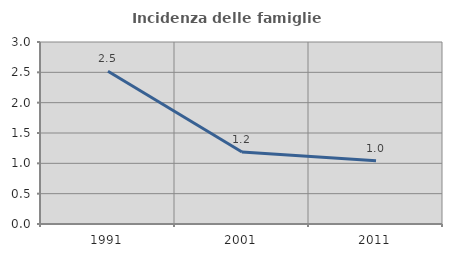
| Category | Incidenza delle famiglie numerose |
|---|---|
| 1991.0 | 2.518 |
| 2001.0 | 1.186 |
| 2011.0 | 1.044 |